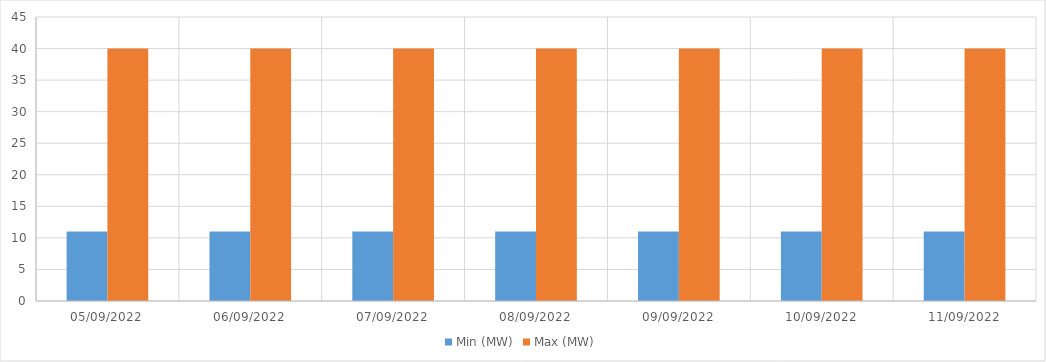
| Category | Min (MW) | Max (MW) |
|---|---|---|
| 05/09/2022 | 11 | 40 |
| 06/09/2022 | 11 | 40 |
| 07/09/2022 | 11 | 40 |
| 08/09/2022 | 11 | 40 |
| 09/09/2022 | 11 | 40 |
| 10/09/2022 | 11 | 40 |
| 11/09/2022 | 11 | 40 |